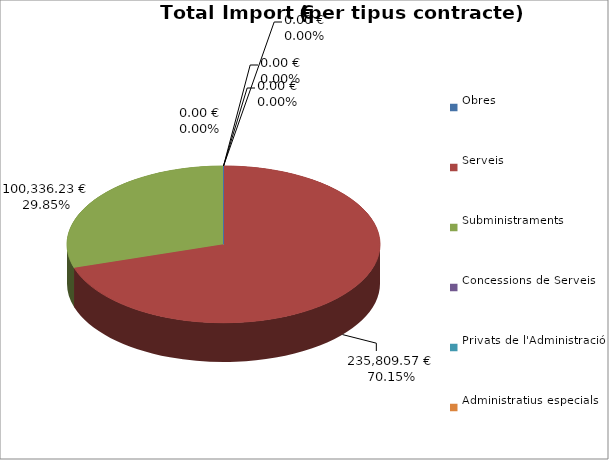
| Category | Total preu
(amb IVA) |
|---|---|
| Obres | 0 |
| Serveis | 235809.57 |
| Subministraments | 100336.23 |
| Concessions de Serveis | 0 |
| Privats de l'Administració | 0 |
| Administratius especials | 0 |